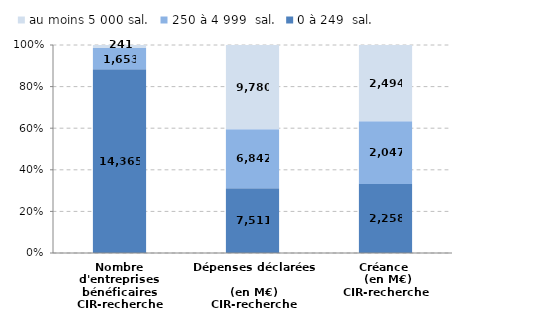
| Category | 0 à 249  sal. | 250 à 4 999  sal. | au moins 5 000 sal. |
|---|---|---|---|
| Nombre d'entreprises bénéficaires
CIR-recherche | 14365 | 1653 | 241 |
| Dépenses déclarées 
(en M€)
CIR-recherche | 7511.28 | 6841.6 | 9780.19 |
| Créance 
 (en M€)
CIR-recherche | 2257.72 | 2046.5 | 2494.42 |